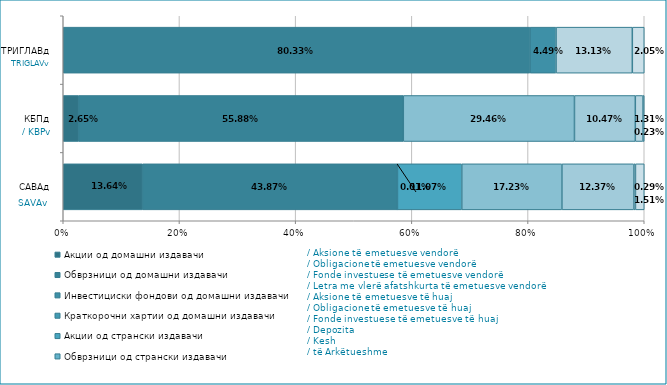
| Category | Акции од домашни издавачи  | Обврзници од домашни издавачи  | Инвестициски фондови од домашни издавачи   | Краткорочни хартии од домашни издавачи   | Акции од странски издавачи   | Обврзници од странски издавачи  | Инвестициски фондови од странски издавчи  | Депозити | Парични средства | Побарувања |
|---|---|---|---|---|---|---|---|---|---|---|
| САВАд | 0.136 | 0.439 | 0 | 0 | 0.111 | 0 | 0.172 | 0.124 | 0.003 | 0.015 |
| КБПд | 0.027 | 0.559 | 0 | 0 | 0 | 0 | 0.295 | 0.105 | 0.013 | 0.002 |
| ТРИГЛАВд | 0 | 0.803 | 0.045 | 0 | 0 | 0 | 0 | 0 | 0.131 | 0.021 |